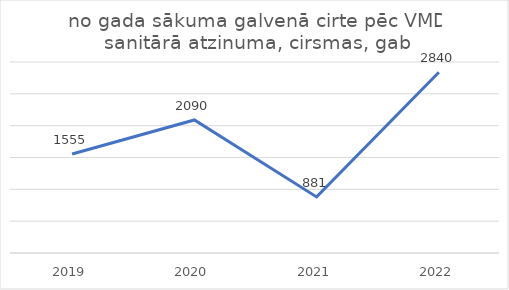
| Category | no gada sākuma galvenā cirte pēc VMD sanitārā atzinuma, cirsmas, gab |
|---|---|
| 2019.0 | 1555 |
| 2020.0 | 2090 |
| 2021.0 | 881 |
| 2022.0 | 2840 |